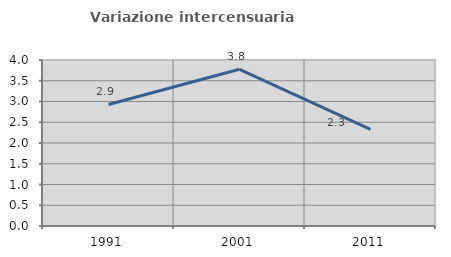
| Category | Variazione intercensuaria annua |
|---|---|
| 1991.0 | 2.929 |
| 2001.0 | 3.776 |
| 2011.0 | 2.328 |